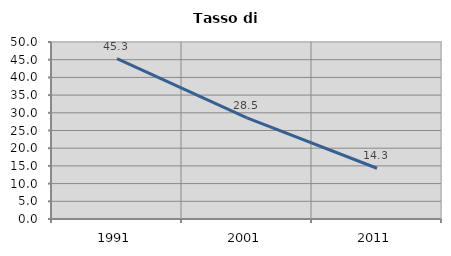
| Category | Tasso di disoccupazione   |
|---|---|
| 1991.0 | 45.279 |
| 2001.0 | 28.542 |
| 2011.0 | 14.331 |